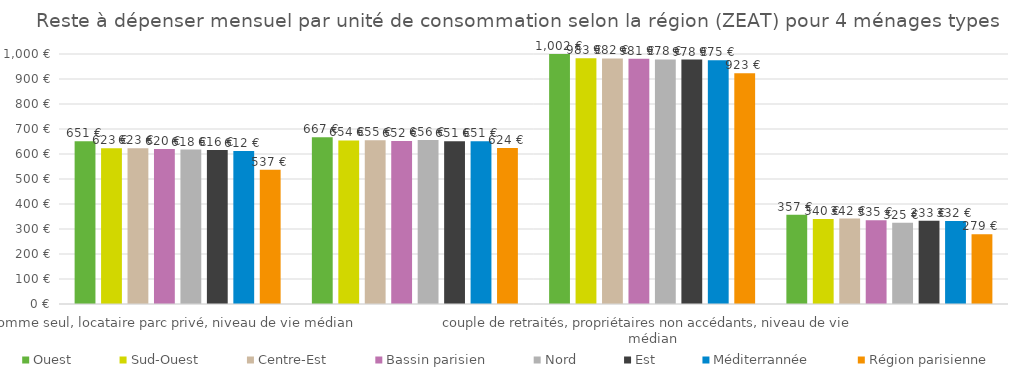
| Category | Ouest | Sud-Ouest | Centre-Est | Bassin parisien | Nord | Est | Méditerrannée | Région parisienne |
|---|---|---|---|---|---|---|---|---|
| homme seul, locataire parc privé, niveau de vie médian | 651.167 | 623.25 | 622.75 | 619.833 | 617.917 | 615.75 | 611.917 | 537.25 |
| couple bi-actifs, deux enfants, accédants à la propriété, niveau de vie médian | 667.167 | 654.167 | 655.167 | 652.167 | 656 | 651.083 | 651.167 | 624.167 |
| couple de retraités, propriétaires non accédants, niveau de vie médian | 1001.611 | 982.944 | 982.278 | 980.722 | 978.444 | 977.778 | 974.778 | 923.056 |
| mère seule, deux enfants, locataire parc social, 1er décile de niveau de vie | 357.417 | 340.281 | 341.948 | 335.125 | 325.49 | 332.573 | 331.635 | 279.083 |